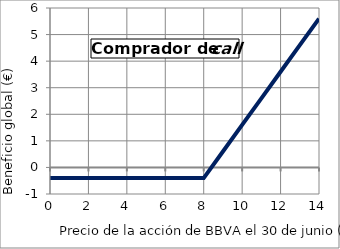
| Category | Comprador |
|---|---|
| 0.0 | -0.4 |
| 1.0 | -0.4 |
| 2.0 | -0.4 |
| 3.0 | -0.4 |
| 4.0 | -0.4 |
| 5.0 | -0.4 |
| 6.0 | -0.4 |
| 7.0 | -0.4 |
| 8.0 | -0.4 |
| 9.0 | 0.6 |
| 10.0 | 1.6 |
| 11.0 | 2.6 |
| 12.0 | 3.6 |
| 13.0 | 4.6 |
| 14.0 | 5.6 |